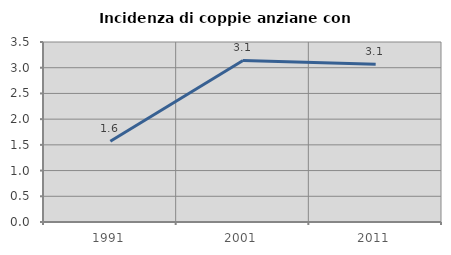
| Category | Incidenza di coppie anziane con figli |
|---|---|
| 1991.0 | 1.571 |
| 2001.0 | 3.141 |
| 2011.0 | 3.07 |